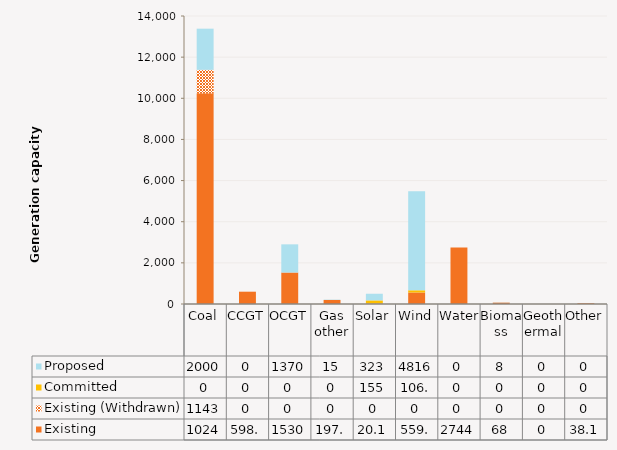
| Category | Existing | Existing (Withdrawn) | Committed | Proposed |
|---|---|---|---|---|
| Coal | 10240.2 | 1143.8 | 0 | 2000 |
| CCGT | 598.2 | 0 | 0 | 0 |
| OCGT | 1530 | 0 | 0 | 1370 |
| Gas other | 197.1 | 0 | 0 | 15 |
| Solar | 20.13 | 0 | 155 | 323 |
| Wind | 559.3 | 0 | 106.7 | 4816.9 |
| Water | 2744.7 | 0 | 0 | 0 |
| Biomass | 68 | 0 | 0 | 8 |
| Geothermal | 0 | 0 | 0 | 0 |
| Other | 38.13 | 0 | 0 | 0 |